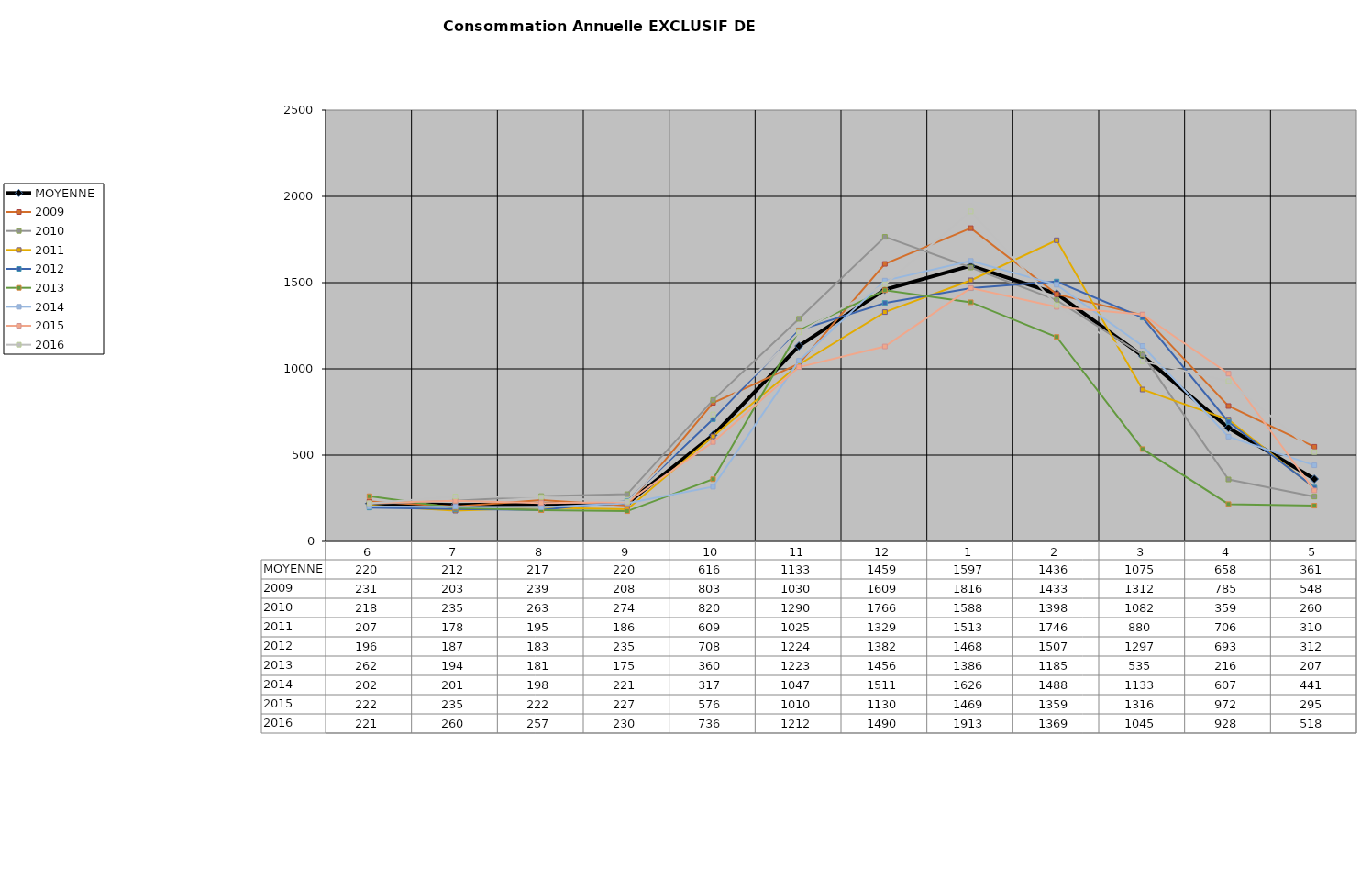
| Category | MOYENNE | 2009 | 2010 | 2011 | 2012 | 2013 | 2014 | 2015 | 2016 |
|---|---|---|---|---|---|---|---|---|---|
| 6 | 219.875 | 231.176 | 218.375 | 207 | 196.062 | 262.062 | 201.667 | 222 | 220.769 |
| 7 | 211.625 | 202.647 | 235.018 | 178.25 | 187.138 | 194 | 201.333 | 235 | 260.157 |
| 8 | 217.25 | 239.432 | 262.607 | 195.15 | 182.8 | 180.857 | 198.237 | 222.293 | 256.717 |
| 9 | 219.5 | 208.038 | 273.636 | 185.933 | 234.625 | 175.143 | 220.763 | 226.907 | 230.357 |
| 10 | 616.125 | 803.094 | 819.764 | 608.767 | 708.375 | 360.375 | 317 | 576.133 | 736 |
| 11 | 1132.625 | 1030.273 | 1290.35 | 1025.329 | 1224 | 1222.625 | 1047 | 1010.409 | 1211.818 |
| 12 | 1459.125 | 1608.633 | 1765.526 | 1329.321 | 1382 | 1456 | 1511.485 | 1130.032 | 1490.182 |
| 1 | 1597.375 | 1816 | 1588.024 | 1513.25 | 1468 | 1386 | 1625.815 | 1468.968 | 1912.882 |
| 2 | 1435.625 | 1432.667 | 1398 | 1745.8 | 1506.581 | 1185 | 1487.7 | 1359.258 | 1369.118 |
| 3 | 1075 | 1312.333 | 1082.1 | 880.2 | 1297.419 | 535 | 1132.8 | 1315.562 | 1044.606 |
| 4 | 658.25 | 784.688 | 358.85 | 706 | 693 | 216 | 607.2 | 972.371 | 928.394 |
| 5 | 361.375 | 548.312 | 259.75 | 310 | 311.938 | 207 | 441 | 295.067 | 518 |